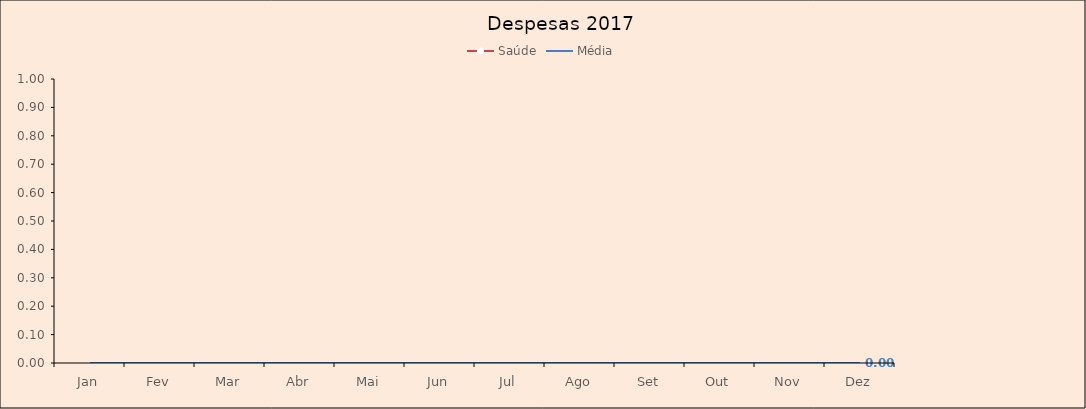
| Category | Saúde | Média |
|---|---|---|
| Jan |  | 0 |
| Fev |  | 0 |
| Mar |  | 0 |
| Abr |  | 0 |
| Mai |  | 0 |
| Jun |  | 0 |
| Jul |  | 0 |
| Ago |  | 0 |
| Set |  | 0 |
| Out |  | 0 |
| Nov |  | 0 |
| Dez |  | 0 |